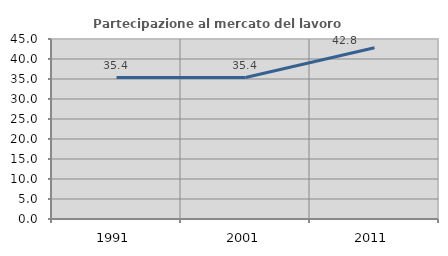
| Category | Partecipazione al mercato del lavoro  femminile |
|---|---|
| 1991.0 | 35.364 |
| 2001.0 | 35.367 |
| 2011.0 | 42.802 |